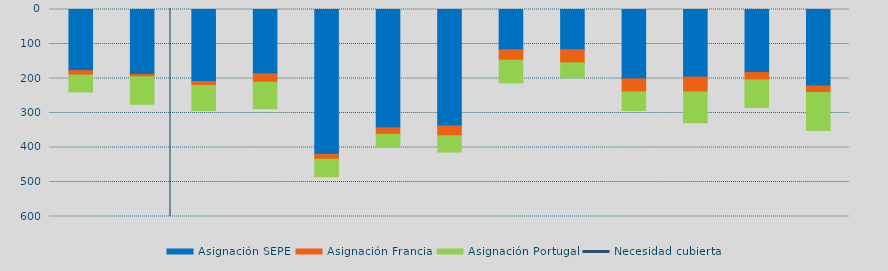
| Category | Asignación SEPE | Asignación Francia | Asignación Portugal |
|---|---|---|---|
| 0 | 177218.25 | 12730.4 | 48945.8 |
| 1 | 188386.325 | 6515.6 | 79746.7 |
| 2 | 208745.675 | 11423.2 | 72605.3 |
| 3 | 186451.1 | 24373.9 | 76706.4 |
| 4 | 419821.425 | 14091.1 | 50867.1 |
| 5 | 342830.4 | 19044.4 | 37683.7 |
| 6 | 337163.825 | 28792 | 47265.2 |
| 7 | 116549.7 | 30280 | 65872.4 |
| 8 | 116506.5 | 38015.1 | 43669.5 |
| 9 | 201179.9 | 37645.7 | 53874.9 |
| 10 | 195827.025 | 43063.3 | 89231.9 |
| 11 | 182309.325 | 21642.7 | 80020.9 |
| 12 | 221780.575 | 19149.1 | 109984.5 |